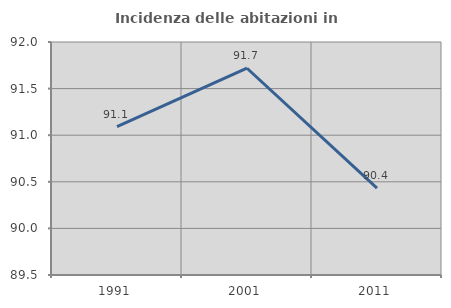
| Category | Incidenza delle abitazioni in proprietà  |
|---|---|
| 1991.0 | 91.093 |
| 2001.0 | 91.718 |
| 2011.0 | 90.432 |